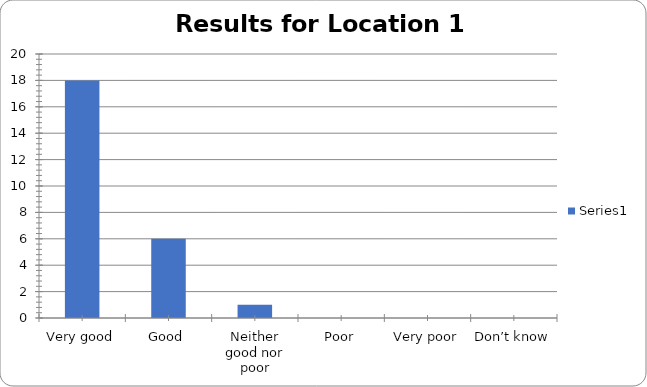
| Category | Series 0 |
|---|---|
| Very good | 18 |
| Good | 6 |
| Neither good nor poor | 1 |
| Poor | 0 |
| Very poor | 0 |
| Don’t know | 0 |